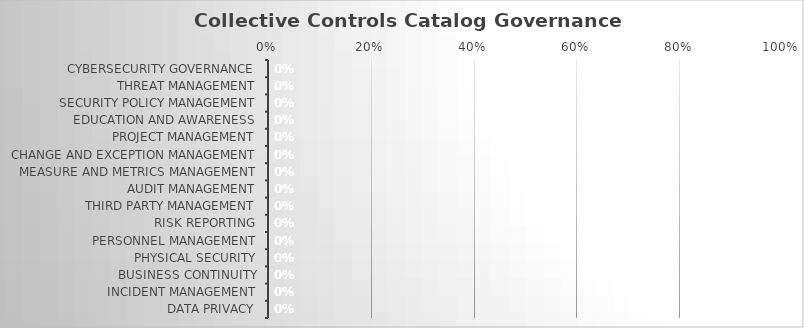
| Category | Implementation Score: |
|---|---|
| Cybersecurity Governance | 0 |
| Threat Management | 0 |
| Security Policy Management | 0 |
| Education and Awareness | 0 |
| Project Management | 0 |
| Change and Exception Management | 0 |
| Measure and Metrics Management | 0 |
| Audit Management | 0 |
| Third Party Management | 0 |
| Risk Reporting | 0 |
| Personnel Management | 0 |
| Physical Security | 0 |
| Business Continuity | 0 |
| Incident Management | 0 |
| Data Privacy | 0 |